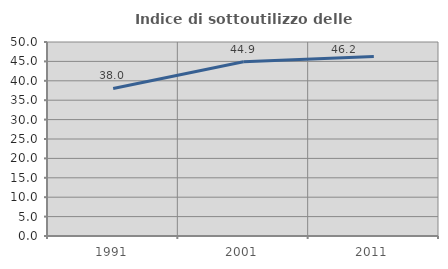
| Category | Indice di sottoutilizzo delle abitazioni  |
|---|---|
| 1991.0 | 38.017 |
| 2001.0 | 44.894 |
| 2011.0 | 46.24 |